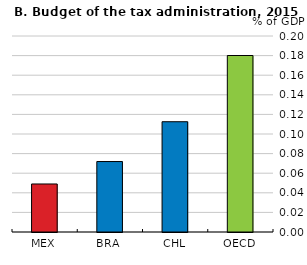
| Category | Operations |
|---|---|
| MEX | 0.049 |
| BRA | 0.072 |
| CHL | 0.113 |
| OECD | 0.18 |